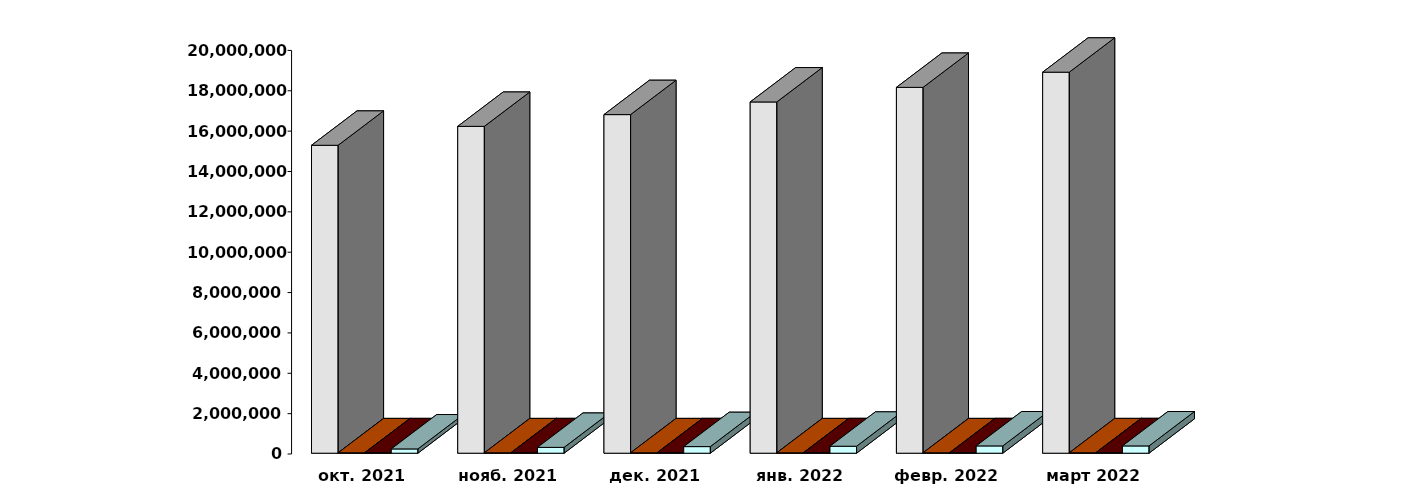
| Category | Физические лица | Юридические лица | Иностранные лица | Клиенты, передавшие свои средства в ДУ |
|---|---|---|---|---|
| 2021-10-28 | 15258509 | 20154 | 21894 | 212008 |
| 2021-11-28 | 16196130 | 20272 | 22719 | 288895 |
| 2021-12-28 | 16779069 | 20446 | 23517 | 327432 |
| 2022-01-28 | 17405817 | 20536 | 24147 | 345411 |
| 2022-02-28 | 18128529 | 20698 | 24500 | 361205 |
| 2022-03-31 | 18881687 | 21131 | 24421 | 360205 |